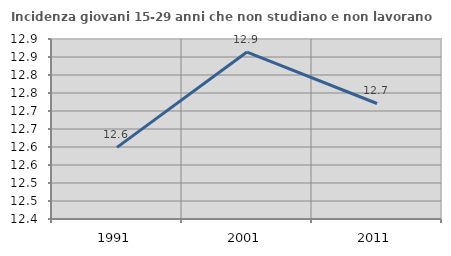
| Category | Incidenza giovani 15-29 anni che non studiano e non lavorano  |
|---|---|
| 1991.0 | 12.599 |
| 2001.0 | 12.864 |
| 2011.0 | 12.721 |